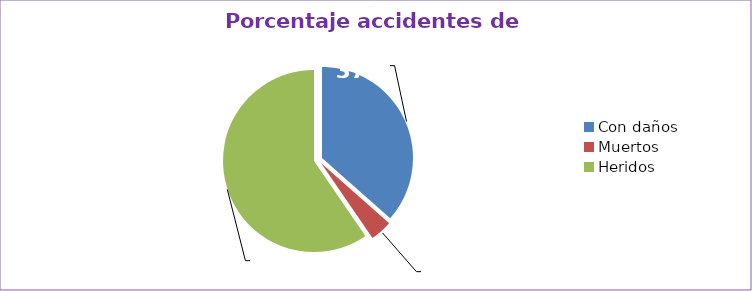
| Category | Series 0 |
|---|---|
| Con daños  | 36.522 |
| Muertos  | 3.913 |
| Heridos  | 59.565 |